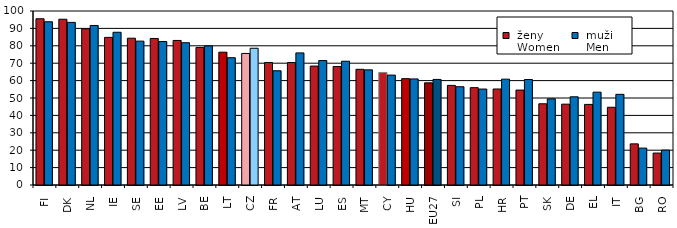
| Category |  ženy 
 Women |  muži 
 Men |
|---|---|---|
| FI | 95.544 | 93.819 |
| DK | 95.263 | 93.447 |
| NL | 89.759 | 91.677 |
| IE | 84.837 | 87.783 |
| SE | 84.366 | 82.679 |
| EE | 84.221 | 82.456 |
| LV | 83.077 | 81.766 |
| BE | 79.064 | 79.953 |
| LT | 76.323 | 73.168 |
| CZ | 75.608 | 78.584 |
| FR | 70.382 | 65.645 |
| AT | 70.364 | 75.924 |
| LU | 68.349 | 71.508 |
| ES | 68.099 | 71.134 |
| MT | 66.488 | 66.166 |
| CY | 64.685 | 63.157 |
| HU | 61.117 | 60.969 |
| EU27 | 58.707 | 60.677 |
| SI | 57.25 | 56.482 |
| PL | 55.942 | 55.144 |
| HR | 55.175 | 60.823 |
| PT | 54.558 | 60.619 |
| SK | 46.684 | 49.513 |
| DE | 46.457 | 50.687 |
| EL | 46.32 | 53.365 |
| IT | 44.684 | 52.109 |
| BG | 23.642 | 21.202 |
| RO | 18.357 | 20.036 |